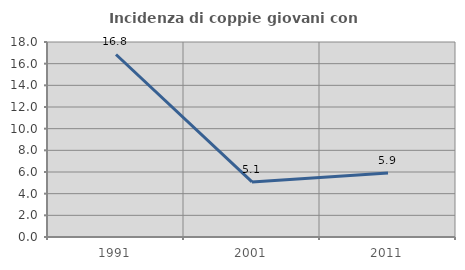
| Category | Incidenza di coppie giovani con figli |
|---|---|
| 1991.0 | 16.848 |
| 2001.0 | 5.085 |
| 2011.0 | 5.917 |